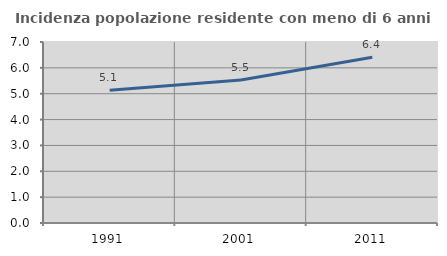
| Category | Incidenza popolazione residente con meno di 6 anni |
|---|---|
| 1991.0 | 5.13 |
| 2001.0 | 5.528 |
| 2011.0 | 6.41 |